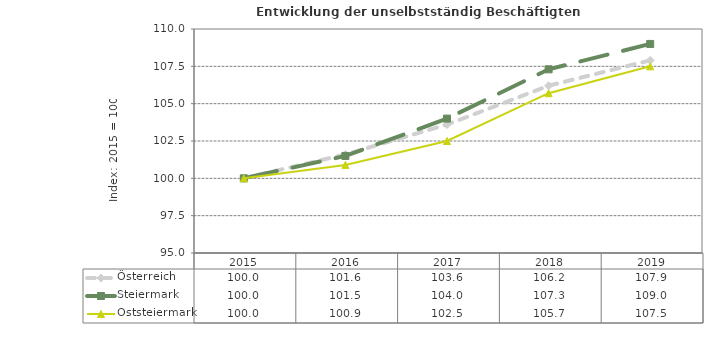
| Category | Österreich | Steiermark | Oststeiermark |
|---|---|---|---|
| 2019.0 | 107.9 | 109 | 107.5 |
| 2018.0 | 106.2 | 107.3 | 105.7 |
| 2017.0 | 103.6 | 104 | 102.5 |
| 2016.0 | 101.6 | 101.5 | 100.9 |
| 2015.0 | 100 | 100 | 100 |